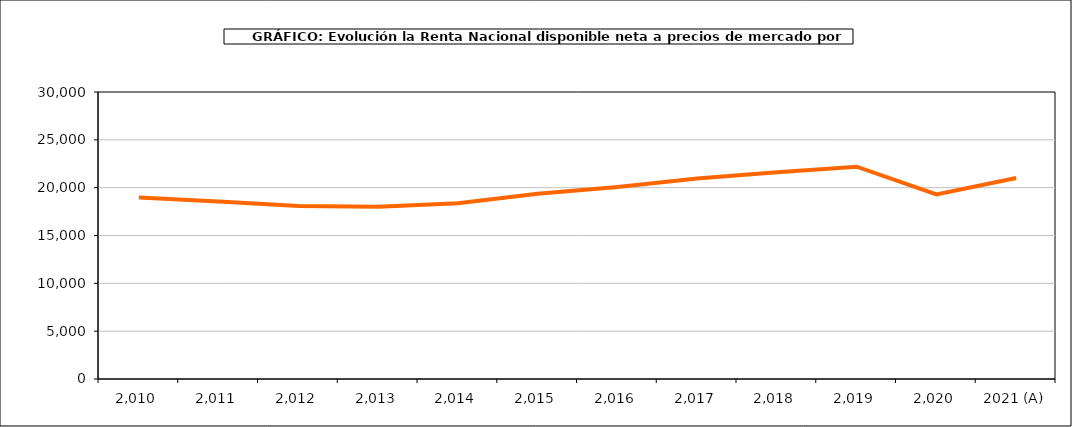
| Category | Renta por habitante |
|---|---|
| 2.010 | 18962.545 |
| 2.011 | 18556.102 |
| 2.012 | 18089.595 |
| 2.013 | 18003.198 |
| 2.014 | 18376.321 |
| 2.015 | 19359.233 |
| 2.016 | 20080.344 |
| 2.017 | 20947.177 |
| 2.018 | 21623.36 |
| 2.019 | 22194.077 |
| 2.020 | 19290.459 |
| 2021 (A) | 21016.015 |